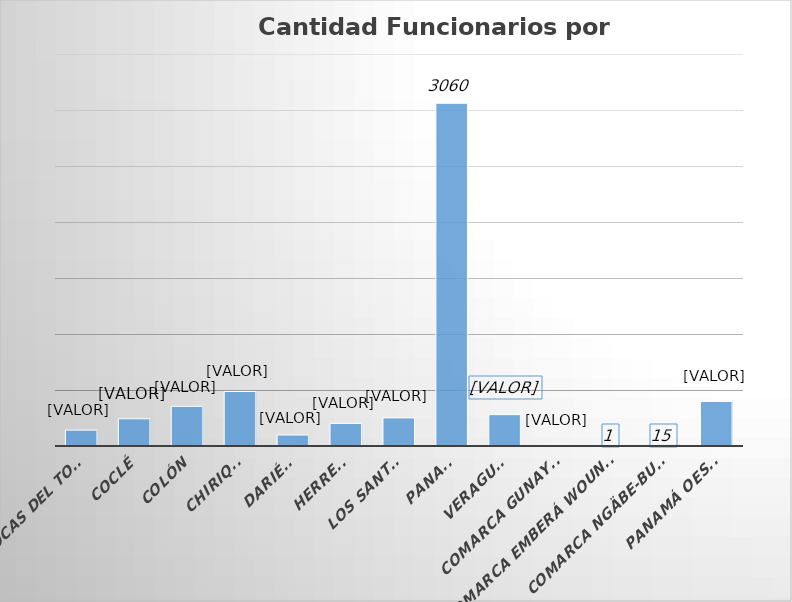
| Category | Cantidad  |
|---|---|
| BOCAS DEL TORO | 142 |
| COCLÉ | 243 |
| COLÓN | 354 |
| CHIRIQUÍ | 487 |
| DARIÉN | 98 |
| HERRERA | 202 |
| LOS SANTOS | 251 |
| PANAMÁ | 3060 |
| VERAGUAS | 280 |
| COMARCA GUNAYALA | 7 |
| COMARCA EMBERÁ WOUNAAN | 1 |
| COMARCA NGÄBE-BUGLÉ | 15 |
| PANAMÁ OESTE | 398 |